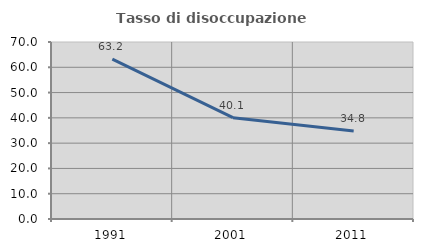
| Category | Tasso di disoccupazione giovanile  |
|---|---|
| 1991.0 | 63.21 |
| 2001.0 | 40.058 |
| 2011.0 | 34.829 |